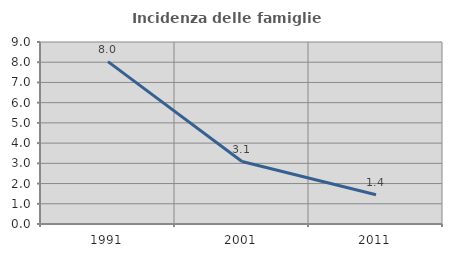
| Category | Incidenza delle famiglie numerose |
|---|---|
| 1991.0 | 8.031 |
| 2001.0 | 3.091 |
| 2011.0 | 1.449 |